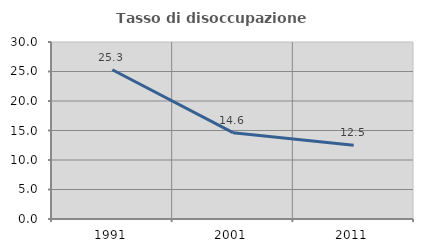
| Category | Tasso di disoccupazione giovanile  |
|---|---|
| 1991.0 | 25.301 |
| 2001.0 | 14.634 |
| 2011.0 | 12.5 |